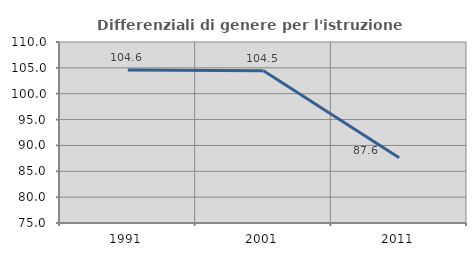
| Category | Differenziali di genere per l'istruzione superiore |
|---|---|
| 1991.0 | 104.572 |
| 2001.0 | 104.451 |
| 2011.0 | 87.597 |